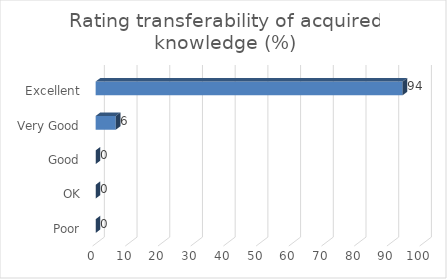
| Category | Rating transferability of acquired knowledge (%) |
|---|---|
| Poor | 0 |
| OK | 0 |
| Good | 0 |
| Very Good | 6.15 |
| Excellent | 93.84 |